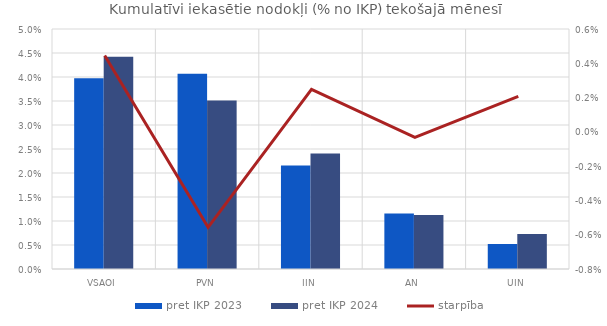
| Category | pret IKP 2023 | pret IKP 2024 |
|---|---|---|
| VSAOI | 0.04 | 0.044 |
| PVN | 0.041 | 0.035 |
| IIN | 0.022 | 0.024 |
| AN | 0.012 | 0.011 |
| UIN | 0.005 | 0.007 |